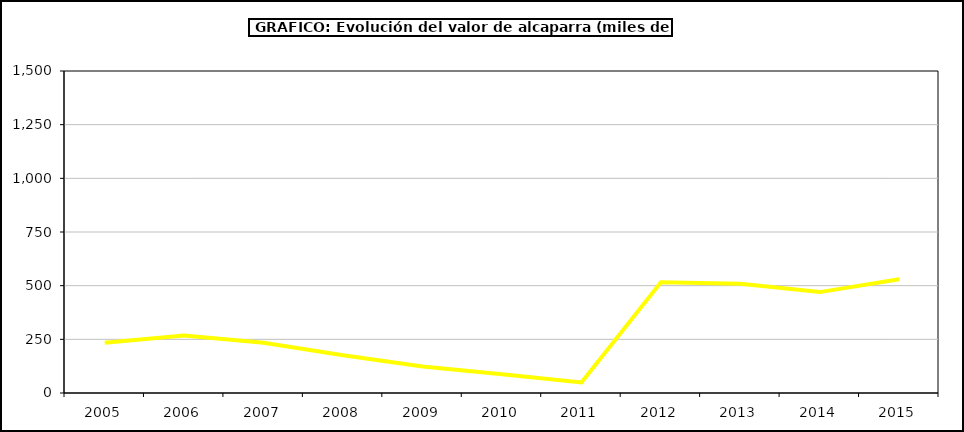
| Category | producción |
|---|---|
| 2005.0 | 233.987 |
| 2006.0 | 268.2 |
| 2007.0 | 233.651 |
| 2008.0 | 175.54 |
| 2009.0 | 123.08 |
| 2010.0 | 87.75 |
| 2011.0 | 49.5 |
| 2012.0 | 516 |
| 2013.0 | 508.5 |
| 2014.0 | 470 |
| 2015.0 | 530 |